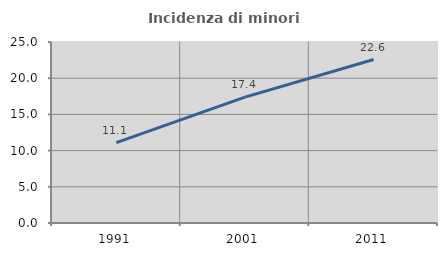
| Category | Incidenza di minori stranieri |
|---|---|
| 1991.0 | 11.111 |
| 2001.0 | 17.391 |
| 2011.0 | 22.581 |